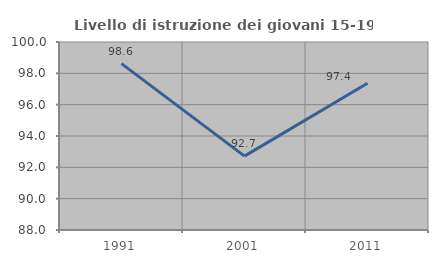
| Category | Livello di istruzione dei giovani 15-19 anni |
|---|---|
| 1991.0 | 98.618 |
| 2001.0 | 92.715 |
| 2011.0 | 97.368 |